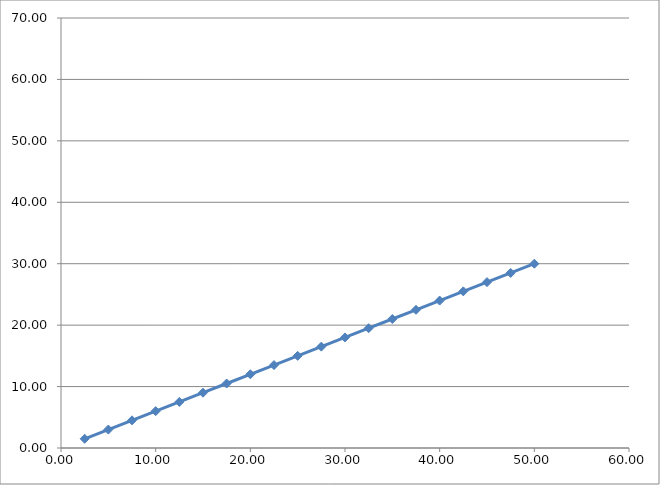
| Category | Series 0 |
|---|---|
| 2.5 | 1.5 |
| 5.0 | 3 |
| 7.5 | 4.5 |
| 10.0 | 6 |
| 12.5 | 7.5 |
| 15.0 | 9 |
| 17.5 | 10.5 |
| 20.0 | 12 |
| 22.5 | 13.5 |
| 25.0 | 15 |
| 27.5 | 16.5 |
| 30.0 | 18 |
| 32.5 | 19.5 |
| 35.0 | 21 |
| 37.5 | 22.5 |
| 40.0 | 24 |
| 42.5 | 25.5 |
| 45.0 | 27 |
| 47.5 | 28.5 |
| 50.0 | 30 |